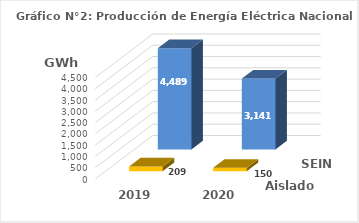
| Category | Aislados | SEIN |
|---|---|---|
| 2019.0 | 209.035 | 4489.41 |
| 2020.0 | 149.667 | 3141.239 |